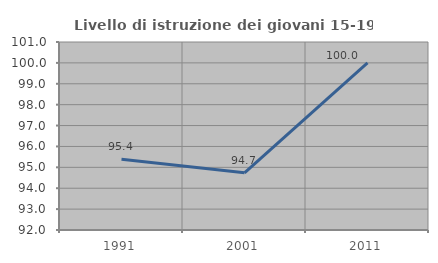
| Category | Livello di istruzione dei giovani 15-19 anni |
|---|---|
| 1991.0 | 95.385 |
| 2001.0 | 94.737 |
| 2011.0 | 100 |